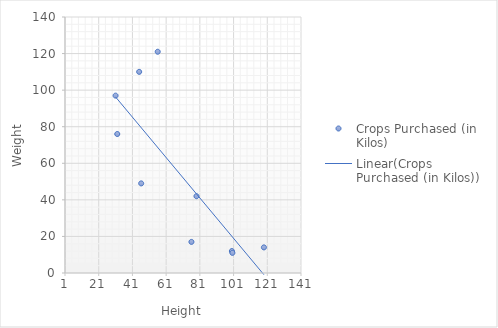
| Category | Crops Purchased (in Kilos) |
|---|---|
| 56.0 | 121 |
| 31.0 | 97 |
| 79.0 | 42 |
| 100.0 | 12 |
| 45.0 | 110 |
| 32.0 | 76 |
| 119.0 | 14 |
| 76.0 | 17 |
| 100.3 | 11 |
| 46.2 | 49 |